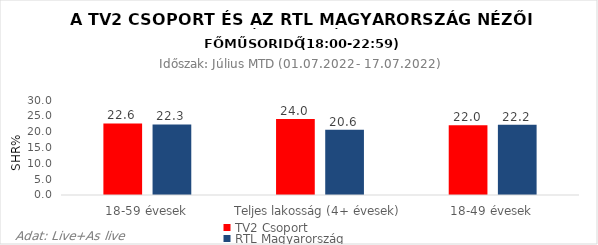
| Category | TV2 Csoport | RTL Magyarország |
|---|---|---|
| 18-59 évesek | 22.6 | 22.3 |
| Teljes lakosság (4+ évesek) | 24 | 20.6 |
| 18-49 évesek | 22 | 22.2 |